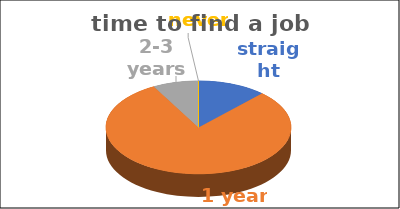
| Category | time to find a job | Series 1 | Series 2 | Series 3 | Series 4 |
|---|---|---|---|---|---|
| straight away | 0.12 |  |  |  |  |
| 1 year | 0.8 |  |  |  |  |
| 2-3 years | 0.08 |  |  |  |  |
| never | 0 |  |  |  |  |